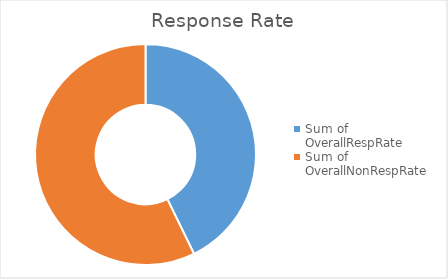
| Category | Total |
|---|---|
| Sum of OverallRespRate | 42.771 |
| Sum of OverallNonRespRate | 57.229 |